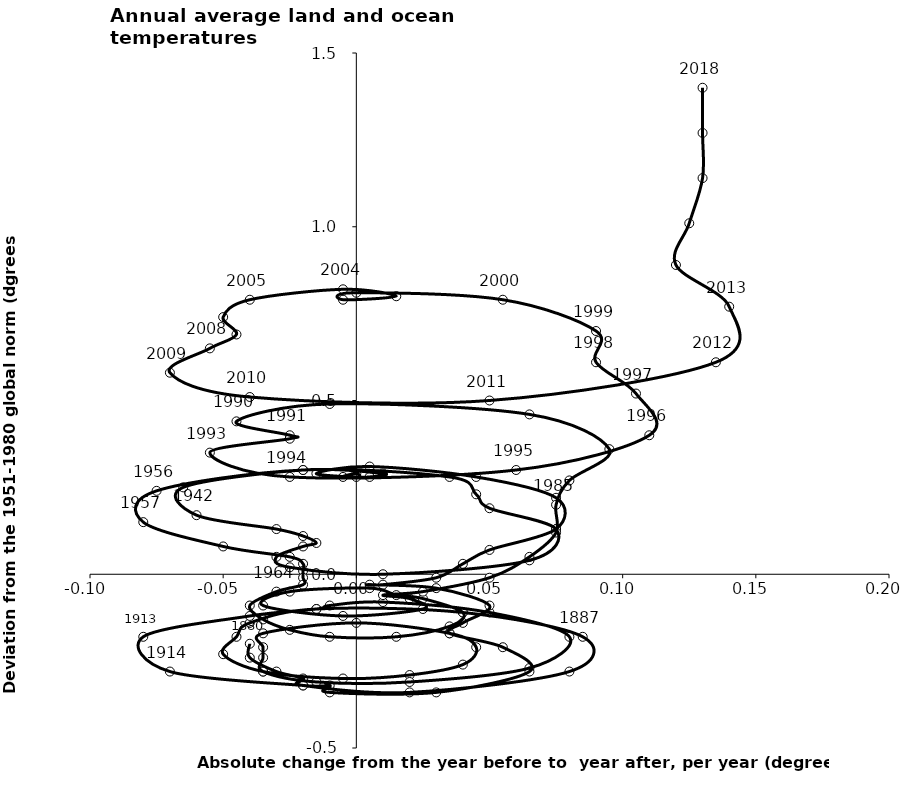
| Category | Series 0 |
|---|---|
| -0.03999999999999998 | -0.2 |
| -0.04000000000000001 | -0.24 |
| -0.03 | -0.28 |
| -0.01999999999999999 | -0.3 |
| -0.020000000000000018 | -0.32 |
| 0.01999999999999999 | -0.34 |
| 0.08000000000000002 | -0.28 |
| 0.08500000000000002 | -0.18 |
| 0.039999999999999994 | -0.11 |
| -0.015000000000000006 | -0.1 |
| -0.039999999999999994 | -0.14 |
| -0.045 | -0.18 |
| -0.05000000000000002 | -0.23 |
| -0.03499999999999999 | -0.28 |
| -0.004999999999999977 | -0.3 |
| 0.01999999999999999 | -0.29 |
| 0.039999999999999994 | -0.26 |
| 0.045 | -0.21 |
| 0.03499999999999999 | -0.17 |
| 0.0 | -0.14 |
| -0.03499999999999999 | -0.17 |
| -0.03499999999999999 | -0.21 |
| -0.03500000000000002 | -0.24 |
| -0.035 | -0.28 |
| -0.014999999999999986 | -0.31 |
| 0.01999999999999999 | -0.31 |
| 0.065 | -0.27 |
| 0.08000000000000002 | -0.18 |
| 0.049999999999999996 | -0.11 |
| 0.010000000000000002 | -0.08 |
| -0.010000000000000002 | -0.09 |
| -0.015 | -0.1 |
| -0.039999999999999994 | -0.12 |
| -0.08000000000000002 | -0.18 |
| -0.07 | -0.28 |
| -0.01999999999999999 | -0.32 |
| -0.010000000000000009 | -0.32 |
| -0.010000000000000009 | -0.34 |
| 0.03 | -0.34 |
| 0.06500000000000002 | -0.28 |
| 0.05500000000000001 | -0.21 |
| 0.03499999999999999 | -0.17 |
| 0.04000000000000001 | -0.14 |
| 0.05 | -0.09 |
| 0.03 | -0.04 |
| 0.005000000000000001 | -0.03 |
| 0.009999999999999998 | -0.03 |
| 0.03 | -0.01 |
| 0.04 | 0.03 |
| 0.05 | 0.07 |
| 0.075 | 0.13 |
| 0.07500000000000001 | 0.22 |
| 0.045 | 0.28 |
| 0.004999999999999977 | 0.31 |
| -0.014999999999999986 | 0.29 |
| 0.0 | 0.28 |
| 0.0 | 0.29 |
| -0.004999999999999977 | 0.28 |
| 0.004999999999999977 | 0.28 |
| 0.009999999999999981 | 0.29 |
| -0.01999999999999999 | 0.3 |
| -0.06499999999999999 | 0.25 |
| -0.06 | 0.17 |
| -0.030000000000000006 | 0.13 |
| -0.020000000000000004 | 0.11 |
| -0.015 | 0.09 |
| -0.019999999999999997 | 0.08 |
| -0.03 | 0.05 |
| -0.025 | 0.02 |
| 0.01 | 0 |
| 0.065 | 0.04 |
| 0.075 | 0.13 |
| 0.05 | 0.19 |
| 0.04500000000000001 | 0.23 |
| 0.03499999999999999 | 0.28 |
| -0.020000000000000018 | 0.3 |
| -0.075 | 0.24 |
| -0.07999999999999999 | 0.15 |
| -0.049999999999999996 | 0.08 |
| -0.025 | 0.05 |
| -0.02 | 0.03 |
| -0.02 | 0.01 |
| -0.02 | -0.01 |
| -0.02 | -0.03 |
| -0.03 | -0.05 |
| -0.04 | -0.09 |
| -0.035 | -0.13 |
| -0.024999999999999994 | -0.16 |
| -0.009999999999999995 | -0.18 |
| 0.015 | -0.18 |
| 0.034999999999999996 | -0.15 |
| 0.039999999999999994 | -0.11 |
| 0.025 | -0.07 |
| 0.015000000000000003 | -0.06 |
| 0.0049999999999999975 | -0.04 |
| -0.024999999999999998 | -0.05 |
| -0.034999999999999996 | -0.09 |
| -0.0050000000000000044 | -0.12 |
| 0.024999999999999994 | -0.1 |
| 0.020000000000000004 | -0.07 |
| 0.010000000000000002 | -0.06 |
| 0.024999999999999998 | -0.05 |
| 0.05 | -0.01 |
| 0.065 | 0.05 |
| 0.07500000000000001 | 0.12 |
| 0.07500000000000001 | 0.2 |
| 0.07999999999999999 | 0.27 |
| 0.095 | 0.36 |
| 0.065 | 0.46 |
| -0.010000000000000009 | 0.49 |
| -0.044999999999999984 | 0.44 |
| -0.024999999999999994 | 0.4 |
| -0.025000000000000022 | 0.39 |
| -0.05499999999999999 | 0.35 |
| -0.024999999999999994 | 0.28 |
| 0.06 | 0.3 |
| 0.11000000000000001 | 0.4 |
| 0.10499999999999998 | 0.52 |
| 0.08999999999999997 | 0.61 |
| 0.09000000000000002 | 0.7 |
| 0.05500000000000005 | 0.79 |
| 0.0 | 0.81 |
| -0.0050000000000000044 | 0.79 |
| 0.014999999999999958 | 0.8 |
| -0.0050000000000000044 | 0.82 |
| -0.03999999999999998 | 0.79 |
| -0.050000000000000044 | 0.74 |
| -0.044999999999999984 | 0.69 |
| -0.05499999999999999 | 0.65 |
| -0.07 | 0.58 |
| -0.03999999999999998 | 0.51 |
| 0.04999999999999999 | 0.5 |
| 0.135 | 0.61 |
| 0.14 | 0.77 |
| 0.12 | 0.89 |
| 0.12499999999999994 | 1.01 |
| 0.13 | 1.14 |
| 0.13 | 1.27 |
| 0.1299999999999999 | 1.4 |